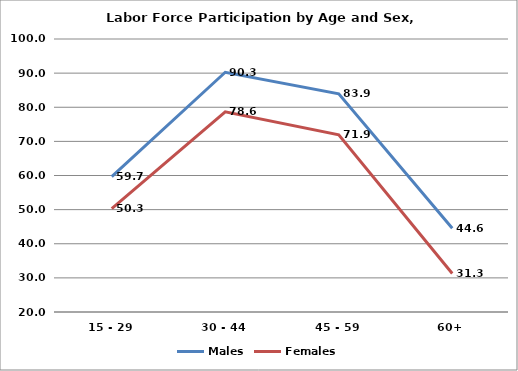
| Category | Males | Females |
|---|---|---|
| 15 - 29 | 59.683 | 50.321 |
| 30 - 44 | 90.253 | 78.641 |
| 45 - 59 | 83.948 | 71.928 |
| 60+ | 44.554 | 31.299 |